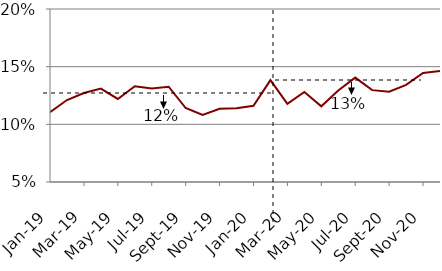
| Category | Series 0 |
|---|---|
| 2019-01-01 | 0.11 |
| 2019-02-01 | 0.121 |
| 2019-03-01 | 0.127 |
| 2019-04-01 | 0.131 |
| 2019-05-01 | 0.122 |
| 2019-06-01 | 0.133 |
| 2019-07-01 | 0.131 |
| 2019-08-01 | 0.133 |
| 2019-09-01 | 0.114 |
| 2019-10-01 | 0.108 |
| 2019-11-01 | 0.113 |
| 2019-12-01 | 0.114 |
| 2020-01-01 | 0.116 |
| 2020-02-01 | 0.138 |
| 2020-03-01 | 0.118 |
| 2020-04-01 | 0.128 |
| 2020-05-01 | 0.116 |
| 2020-06-01 | 0.129 |
| 2020-07-01 | 0.141 |
| 2020-08-01 | 0.13 |
| 2020-09-01 | 0.128 |
| 2020-10-01 | 0.134 |
| 2020-11-01 | 0.145 |
| 2020-12-01 | 0.146 |